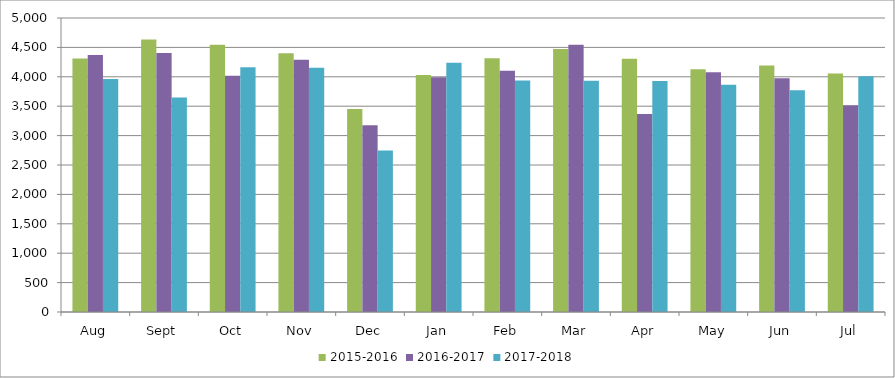
| Category | 2015-2016 | 2016-2017 | 2017-2018 |
|---|---|---|---|
| Aug | 4310 | 4370 | 3964 |
| Sept | 4633 | 4404 | 3647 |
| Oct | 4546 | 4018 | 4164 |
| Nov | 4402 | 4291 | 4152 |
| Dec | 3451 | 3177 | 2748 |
| Jan | 4030 | 3993 | 4239 |
| Feb | 4315 | 4102 | 3939 |
| Mar | 4472 | 4546 | 3933 |
| Apr | 4305 | 3368 | 3930 |
| May | 4127 | 4079 | 3864 |
| Jun | 4194 | 3974 | 3773 |
| Jul | 4057 | 3518 | 4009 |